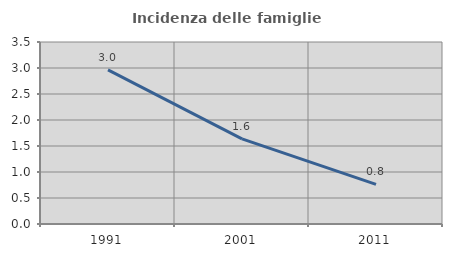
| Category | Incidenza delle famiglie numerose |
|---|---|
| 1991.0 | 2.963 |
| 2001.0 | 1.636 |
| 2011.0 | 0.763 |